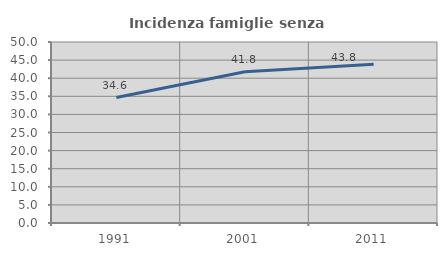
| Category | Incidenza famiglie senza nuclei |
|---|---|
| 1991.0 | 34.65 |
| 2001.0 | 41.767 |
| 2011.0 | 43.846 |